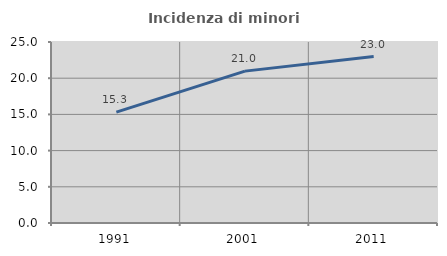
| Category | Incidenza di minori stranieri |
|---|---|
| 1991.0 | 15.315 |
| 2001.0 | 20.977 |
| 2011.0 | 22.988 |